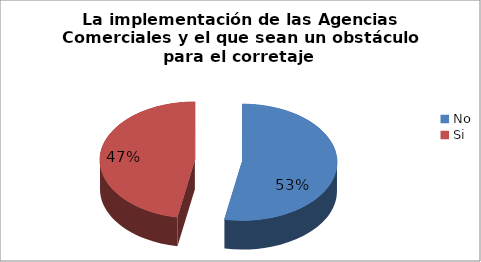
| Category | Series 0 |
|---|---|
| No | 9 |
| Si | 8 |